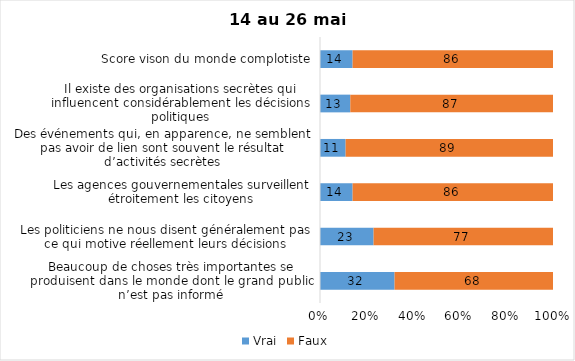
| Category | Vrai | Faux |
|---|---|---|
| Beaucoup de choses très importantes se produisent dans le monde dont le grand public n’est pas informé | 32 | 68 |
| Les politiciens ne nous disent généralement pas ce qui motive réellement leurs décisions | 23 | 77 |
| Les agences gouvernementales surveillent étroitement les citoyens | 14 | 86 |
| Des événements qui, en apparence, ne semblent pas avoir de lien sont souvent le résultat d’activités secrètes | 11 | 89 |
| Il existe des organisations secrètes qui influencent considérablement les décisions politiques | 13 | 87 |
| Score vison du monde complotiste | 14 | 86 |